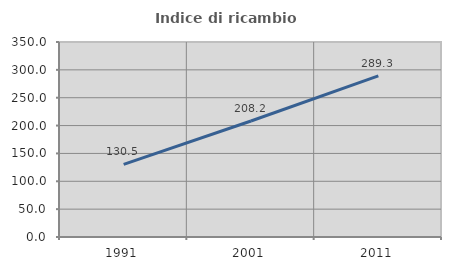
| Category | Indice di ricambio occupazionale  |
|---|---|
| 1991.0 | 130.461 |
| 2001.0 | 208.19 |
| 2011.0 | 289.305 |